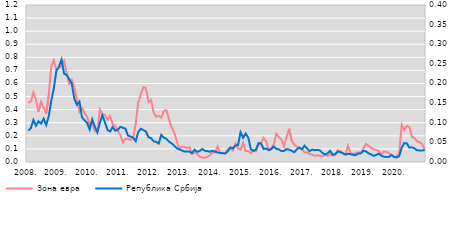
| Category | Зона евра  |
|---|---|
| 2008. | 0.454 |
|  | 0.461 |
|  | 0.533 |
|  | 0.478 |
|  | 0.384 |
|  | 0.46 |
|  | 0.417 |
|  | 0.368 |
|  | 0.51 |
|  | 0.734 |
|  | 0.778 |
|  | 0.7 |
| 2009. | 0.719 |
|  | 0.734 |
|  | 0.772 |
|  | 0.679 |
|  | 0.598 |
|  | 0.628 |
|  | 0.578 |
|  | 0.478 |
|  | 0.383 |
|  | 0.412 |
|  | 0.375 |
|  | 0.345 |
| 2010. | 0.284 |
|  | 0.307 |
|  | 0.235 |
|  | 0.232 |
|  | 0.401 |
|  | 0.363 |
|  | 0.36 |
|  | 0.323 |
|  | 0.352 |
|  | 0.29 |
|  | 0.275 |
|  | 0.239 |
| 2011. | 0.205 |
|  | 0.15 |
|  | 0.178 |
|  | 0.176 |
|  | 0.169 |
|  | 0.185 |
|  | 0.294 |
|  | 0.455 |
|  | 0.518 |
|  | 0.573 |
|  | 0.566 |
|  | 0.458 |
| 2012. | 0.474 |
|  | 0.378 |
|  | 0.346 |
|  | 0.353 |
|  | 0.34 |
|  | 0.39 |
|  | 0.398 |
|  | 0.328 |
|  | 0.268 |
|  | 0.229 |
|  | 0.164 |
|  | 0.102 |
| 2013. | 0.119 |
|  | 0.115 |
|  | 0.106 |
|  | 0.113 |
|  | 0.062 |
|  | 0.075 |
|  | 0.06 |
|  | 0.042 |
|  | 0.034 |
|  | 0.033 |
|  | 0.038 |
|  | 0.053 |
| 2014. | 0.073 |
|  | 0.073 |
|  | 0.118 |
|  | 0.068 |
|  | 0.07 |
|  | 0.067 |
|  | 0.098 |
|  | 0.104 |
|  | 0.087 |
|  | 0.141 |
|  | 0.102 |
|  | 0.096 |
| 2015. | 0.146 |
|  | 0.085 |
|  | 0.085 |
|  | 0.067 |
|  | 0.091 |
|  | 0.081 |
|  | 0.126 |
|  | 0.147 |
|  | 0.184 |
|  | 0.156 |
|  | 0.093 |
|  | 0.103 |
| 2016. | 0.137 |
|  | 0.216 |
|  | 0.19 |
|  | 0.17 |
|  | 0.121 |
|  | 0.193 |
|  | 0.254 |
|  | 0.163 |
|  | 0.132 |
|  | 0.119 |
|  | 0.107 |
|  | 0.098 |
| 2017. | 0.075 |
|  | 0.074 |
|  | 0.062 |
|  | 0.056 |
|  | 0.048 |
|  | 0.051 |
|  | 0.048 |
|  | 0.043 |
|  | 0.054 |
|  | 0.046 |
|  | 0.057 |
|  | 0.05 |
| 2018. | 0.052 |
|  | 0.09 |
|  | 0.083 |
|  | 0.064 |
|  | 0.056 |
|  | 0.126 |
|  | 0.07 |
|  | 0.061 |
|  | 0.069 |
|  | 0.074 |
|  | 0.069 |
|  | 0.102 |
| 2019. | 0.138 |
|  | 0.125 |
|  | 0.107 |
|  | 0.097 |
|  | 0.092 |
|  | 0.085 |
|  | 0.056 |
|  | 0.081 |
|  | 0.078 |
|  | 0.069 |
|  | 0.052 |
|  | 0.036 |
| 2020. | 0.045 |